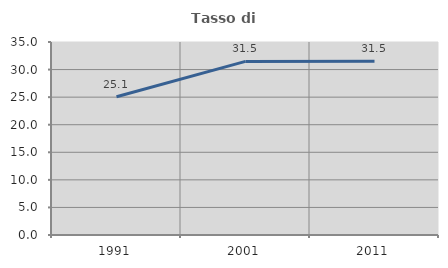
| Category | Tasso di occupazione   |
|---|---|
| 1991.0 | 25.07 |
| 2001.0 | 31.484 |
| 2011.0 | 31.495 |